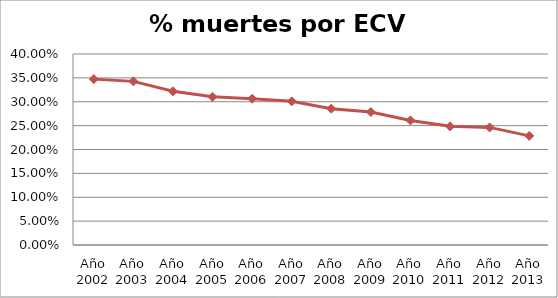
| Category | Series 0 |
|---|---|
| Año 2002 | 0.347 |
| Año 2003 | 0.343 |
| Año 2004 | 0.322 |
| Año 2005 | 0.31 |
| Año 2006 | 0.306 |
| Año 2007 | 0.301 |
| Año 2008 | 0.285 |
| Año 2009 | 0.278 |
| Año 2010 | 0.261 |
| Año 2011 | 0.249 |
| Año 2012 | 0.246 |
| Año 2013 | 0.228 |